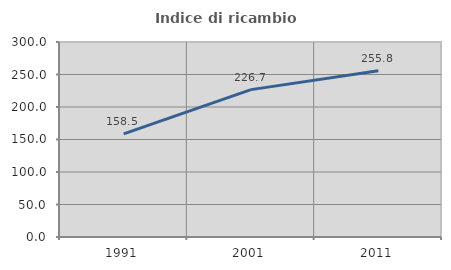
| Category | Indice di ricambio occupazionale  |
|---|---|
| 1991.0 | 158.531 |
| 2001.0 | 226.735 |
| 2011.0 | 255.773 |